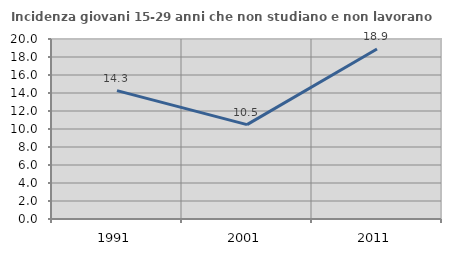
| Category | Incidenza giovani 15-29 anni che non studiano e non lavorano  |
|---|---|
| 1991.0 | 14.261 |
| 2001.0 | 10.487 |
| 2011.0 | 18.894 |